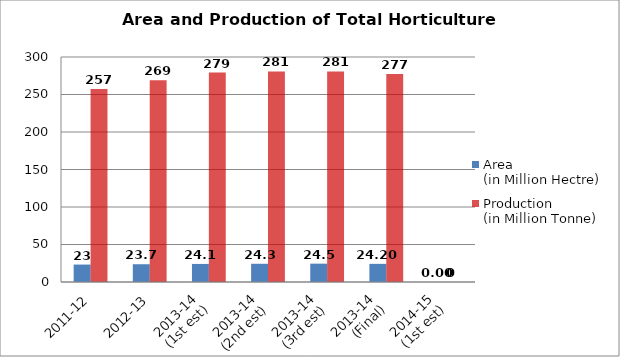
| Category | Area
(in Million Hectre) | Production
(in Million Tonne) |
|---|---|---|
| 2011-12 | 23.242 | 257.277 |
| 2012-13 | 23.694 | 268.847 |
| 2013-14
(1st est) | 24.093 | 279.29 |
| 2013-14
(2nd est) | 24.303 | 280.707 |
| 2013-14
(3rd est) | 24.458 | 280.792 |
| 2013-14
(Final) | 24.198 | 277.352 |
| 2014-15
(1st est) | 0 | 0 |